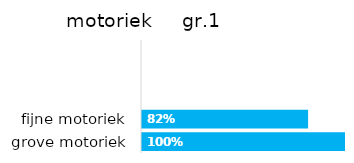
| Category | motoriek gr.1 |
|---|---|
| grove motoriek | 1 |
| fijne motoriek | 0.818 |